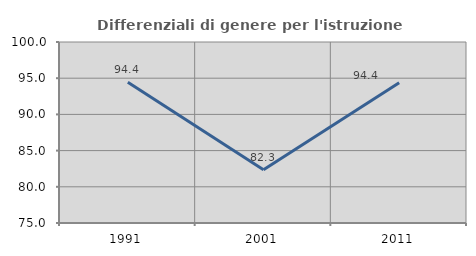
| Category | Differenziali di genere per l'istruzione superiore |
|---|---|
| 1991.0 | 94.431 |
| 2001.0 | 82.343 |
| 2011.0 | 94.374 |